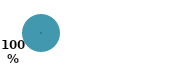
| Category | Series 0 |
|---|---|
| 0 | 1.001 |
| 1 | -0.001 |